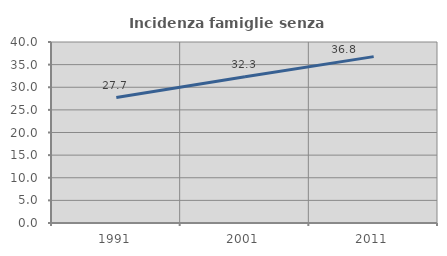
| Category | Incidenza famiglie senza nuclei |
|---|---|
| 1991.0 | 27.715 |
| 2001.0 | 32.323 |
| 2011.0 | 36.769 |